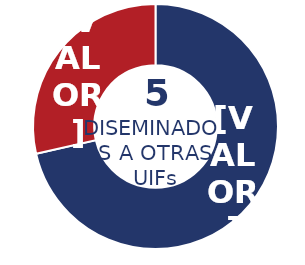
| Category | Series 0 |
|---|---|
| Física | 5 |
| Jurídica | 2 |